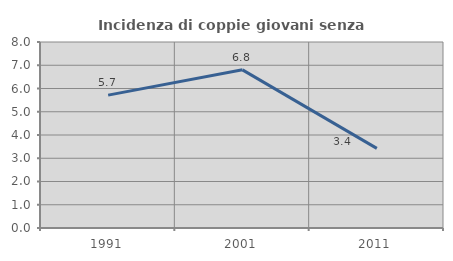
| Category | Incidenza di coppie giovani senza figli |
|---|---|
| 1991.0 | 5.714 |
| 2001.0 | 6.803 |
| 2011.0 | 3.425 |